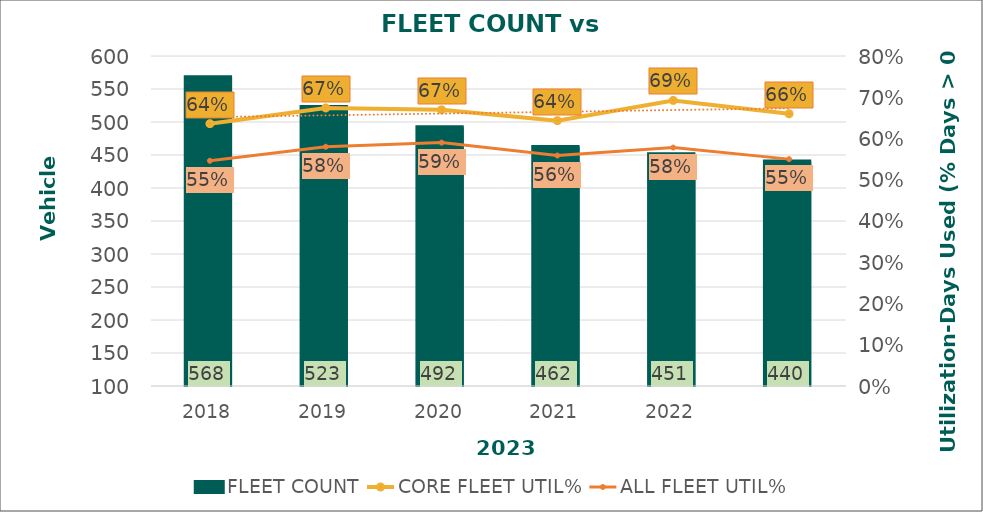
| Category | FLEET COUNT |
|---|---|
| 2018 | 567.75 |
| 2019 | 522.75 |
| 2020 | 492 |
| 2021 | 462 |
| 2022 | 451 |